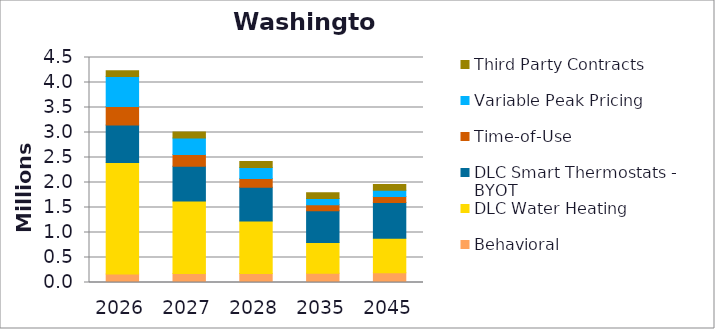
| Category | Behavioral | DLC Water Heating | DLC Smart Thermostats - BYOT | Time-of-Use | Variable Peak Pricing | Third Party Contracts |
|---|---|---|---|---|---|---|
| 2026.0 | 0.172 | 2.23 | 0.749 | 0.368 | 0.599 | 0.117 |
| 2027.0 | 0.18 | 1.448 | 0.695 | 0.234 | 0.334 | 0.117 |
| 2028.0 | 0.18 | 1.052 | 0.673 | 0.174 | 0.223 | 0.117 |
| 2035.0 | 0.186 | 0.613 | 0.637 | 0.119 | 0.124 | 0.117 |
| 2045.0 | 0.195 | 0.688 | 0.715 | 0.12 | 0.126 | 0.117 |